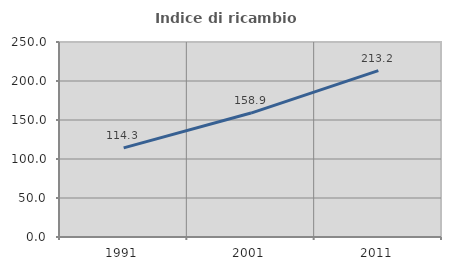
| Category | Indice di ricambio occupazionale  |
|---|---|
| 1991.0 | 114.286 |
| 2001.0 | 158.897 |
| 2011.0 | 213.215 |